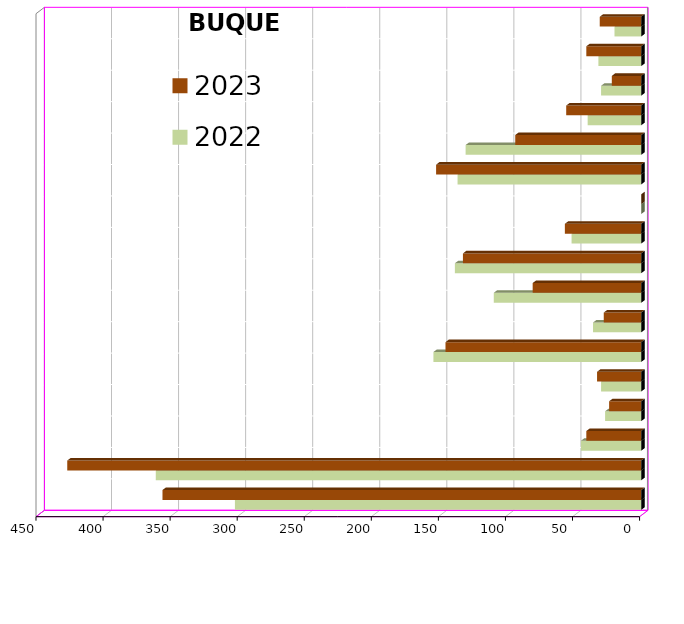
| Category | 2022 | 2023 |
|---|---|---|
| ICAVE | 303 | 357 |
| CICE | 362 | 428 |
| T. C. E. | 45 | 41 |
| CARGILL | 27 | 24 |
| TMV | 30 | 33 |
| SSA | 155 | 146 |
| SEPSA | 36 | 28 |
| VOPAK | 110 | 81 |
| CPV | 139 | 133 |
| EXCELLENCE | 52 | 57 |
| APASCO | 0 | 0 |
| SIPPB | 137 | 153 |
| PEMEX | 131 | 94 |
| PETRA | 40 | 56 |
| OPEVER | 30 | 22 |
| ESJ Renovable III | 32 | 41 |
| Tramitadora del Pac. | 20 | 31 |